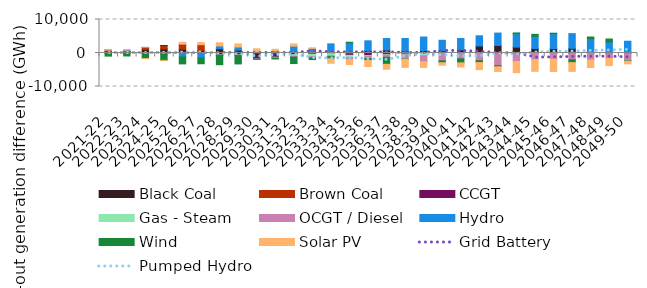
| Category | Black Coal | Brown Coal | CCGT | Gas - Steam | OCGT / Diesel | Hydro | Wind | Solar PV |
|---|---|---|---|---|---|---|---|---|
| 2021-22 | 526.328 | 416.797 | 0 | 1.943 | 1.87 | -8.856 | -921.11 | 0 |
| 2022-23 | 429.962 | 274.767 | 0 | 0.869 | 0.966 | 179.24 | -890.09 | 0 |
| 2023-24 | 1027.065 | 614.874 | 15.981 | 1.914 | 5.358 | -324.4 | -1328.972 | -2.99 |
| 2024-25 | 1212.43 | 1010.035 | 4.141 | -31.887 | -55.508 | -368.189 | -1747.687 | -0.045 |
| 2025-26 | 1135.252 | 1338.556 | 128.857 | -14.676 | -24.373 | -1127.934 | -2084.862 | 596.318 |
| 2026-27 | 761.872 | 1712.488 | -145.587 | -20.362 | -20.4 | -1300.291 | -1720.711 | 639.809 |
| 2027-28 | 1256.187 | -0.007 | -557.508 | -46.346 | -57.424 | 846.136 | -2822.114 | 961.64 |
| 2028-29 | 863.01 | -0.005 | -588.059 | -80.727 | -94.899 | 943.284 | -2498.546 | 922.385 |
| 2029-30 | -1006.232 | -0.005 | -796.371 | -56.11 | -31.539 | 411.466 | -0.287 | 847.35 |
| 2030-31 | -472.727 | -0.005 | -782.715 | -135.92 | -167.593 | 648.844 | -233.81 | 461.191 |
| 2031-32 | 127.233 | -0.005 | -511.119 | -439.645 | -273.378 | 1916.168 | -1920.639 | 678.617 |
| 2032-33 | -159.736 | -0.005 | -208.605 | -695.122 | -383.461 | 1363.264 | -518.025 | 170.711 |
| 2033-34 | 232.135 | -0.005 | -186.206 | -626.854 | -278.479 | 2502.719 | -623.053 | -1335.656 |
| 2034-35 | -464.053 | -0.005 | -223.288 | -657.82 | -614.085 | 3022.872 | 186.921 | -1486.136 |
| 2035-36 | 687.106 | -0.005 | -749.118 | -243.429 | -673.664 | 2949.785 | -567.398 | -1791.581 |
| 2036-37 | 892.284 | -0.004 | -432.663 | -129.686 | -720.937 | 3439.589 | -2098.338 | -1460.455 |
| 2037-38 | 616.202 | -0.002 | -303.644 | -225.015 | -1284.853 | 3715.613 | -58.211 | -2418.746 |
| 2038-39 | 747.639 | -0.002 | -239.664 | -560.103 | -1721.002 | 4020.53 | -36.355 | -1750.252 |
| 2039-40 | 670.342 | -0.002 | -202.155 | -7.46 | -2126.179 | 3130.498 | -558.431 | -747.1 |
| 2040-41 | 948.912 | -0.002 | -96.864 | -7.001 | -1666.089 | 3387.341 | -1185.774 | -1231.836 |
| 2041-42 | 2093.955 | -0.002 | -152.378 | -6.37 | -2146.697 | 3044.161 | -558.23 | -2104.812 |
| 2042-43 | 2238.151 | -0.002 | -308.525 | -25.257 | -3453.18 | 3712.896 | -314.825 | -1426.478 |
| 2043-44 | 1755.684 | -0.002 | -132.247 | -7.354 | -2388.618 | 3985.415 | 251.962 | -3330.465 |
| 2044-45 | 1332.052 | -0.002 | -47.815 | -6.724 | -1926.757 | 3663.452 | 575.054 | -3487.019 |
| 2045-46 | 1300.17 | -0.001 | -11.753 | -3.85 | -1821.159 | 4455.82 | 158.39 | -3700.193 |
| 2046-47 | 1395.228 | -0.001 | 0 | 0 | -2013.075 | 4388.264 | -858.82 | -2613.179 |
| 2047-48 | 142.761 | 0 | 0 | 0 | -2081.899 | 4120.134 | 514.905 | -2251.488 |
| 2048-49 | 46.819 | 0 | 0 | 0 | -1654.971 | 3261.995 | 872.714 | -2098.56 |
| 2049-50 | 49.103 | 0 | 0 | 0 | -2314.046 | 3469.539 | -118.136 | -802.868 |